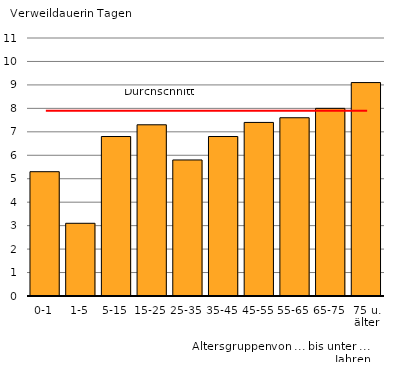
| Category | Series 0 |
|---|---|
| 0-1 | 5.3 |
| 1-5 | 3.1 |
| 5-15 | 6.8 |
| 15-25 | 7.3 |
| 25-35 | 5.8 |
| 35-45 | 6.8 |
| 45-55 | 7.4 |
| 55-65 | 7.6 |
| 65-75 | 8 |
| 75 u. älter | 9.1 |